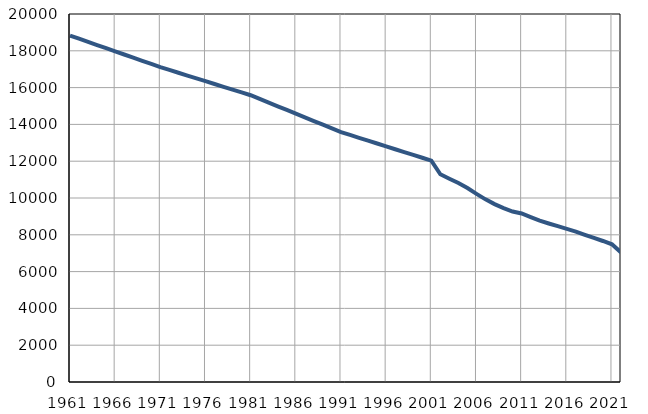
| Category | Population
size |
|---|---|
| 1961.0 | 18829 |
| 1962.0 | 18657 |
| 1963.0 | 18486 |
| 1964.0 | 18314 |
| 1965.0 | 18143 |
| 1966.0 | 17971 |
| 1967.0 | 17799 |
| 1968.0 | 17628 |
| 1969.0 | 17456 |
| 1970.0 | 17285 |
| 1971.0 | 17113 |
| 1972.0 | 16960 |
| 1973.0 | 16808 |
| 1974.0 | 16655 |
| 1975.0 | 16502 |
| 1976.0 | 16350 |
| 1977.0 | 16197 |
| 1978.0 | 16044 |
| 1979.0 | 15891 |
| 1980.0 | 15739 |
| 1981.0 | 15586 |
| 1982.0 | 15385 |
| 1983.0 | 15185 |
| 1984.0 | 14985 |
| 1985.0 | 14784 |
| 1986.0 | 14584 |
| 1987.0 | 14384 |
| 1988.0 | 14183 |
| 1989.0 | 13984 |
| 1990.0 | 13783 |
| 1991.0 | 13582 |
| 1992.0 | 13427 |
| 1993.0 | 13272 |
| 1994.0 | 13116 |
| 1995.0 | 12961 |
| 1996.0 | 12806 |
| 1997.0 | 12651 |
| 1998.0 | 12497 |
| 1999.0 | 12342 |
| 2000.0 | 12186 |
| 2001.0 | 12031 |
| 2002.0 | 11290 |
| 2003.0 | 11048 |
| 2004.0 | 10813 |
| 2005.0 | 10539 |
| 2006.0 | 10227 |
| 2007.0 | 9927 |
| 2008.0 | 9667 |
| 2009.0 | 9454 |
| 2010.0 | 9263 |
| 2011.0 | 9157 |
| 2012.0 | 8958 |
| 2013.0 | 8767 |
| 2014.0 | 8614 |
| 2015.0 | 8468 |
| 2016.0 | 8323 |
| 2017.0 | 8176 |
| 2018.0 | 7998 |
| 2019.0 | 7829 |
| 2020.0 | 7664 |
| 2021.0 | 7482 |
| 2022.0 | 7041 |